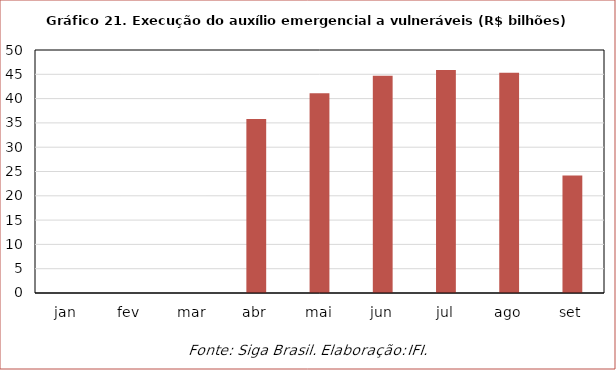
| Category | Execução |
|---|---|
| jan | 0 |
| fev | 0 |
| mar | 0 |
| abr | 35.781 |
| mai | 41.077 |
| jun | 44.682 |
| jul | 45.875 |
| ago | 45.339 |
| set | 24.182 |